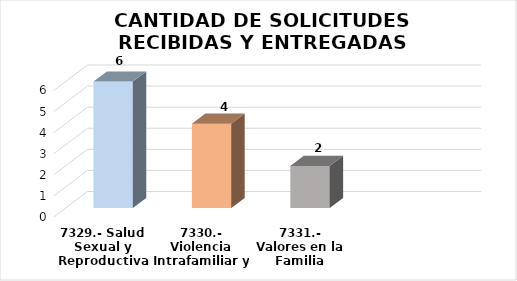
| Category | SOLICITUDES |
|---|---|
| 7329.- Salud Sexual y Reproductiva | 6 |
| 7330.- Violencia Intrafamiliar y de Género | 4 |
| 7331.- Valores en la Familia | 2 |